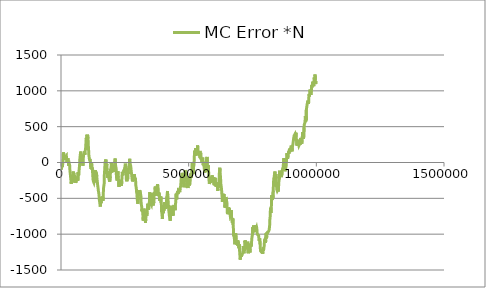
| Category | MC Error *N |
|---|---|
| 1000.0 | -82.468 |
| 2000.0 | -97.616 |
| 3000.0 | -39.064 |
| 4000.0 | -42.076 |
| 5000.0 | -59.528 |
| 6000.0 | -36.891 |
| 7000.0 | -31.486 |
| 8000.0 | 7.544 |
| 9000.0 | 118.393 |
| 10000.0 | 141.556 |
| 11000.0 | 136.393 |
| 12000.0 | 76.069 |
| 13000.0 | 33.678 |
| 14000.0 | 70.791 |
| 15000.0 | 76.55 |
| 16000.0 | 50.126 |
| 17000.0 | 74.916 |
| 18000.0 | 81.093 |
| 19000.0 | 65.289 |
| 20000.0 | 87.07 |
| 21000.0 | 93.611 |
| 22000.0 | 41.49 |
| 23000.0 | 3.009 |
| 24000.0 | 4.289 |
| 25000.0 | -4.933 |
| 26000.0 | 28.36 |
| 27000.0 | 57.634 |
| 28000.0 | 42.338 |
| 29000.0 | 18.747 |
| 30000.0 | -49.297 |
| 31000.0 | -48.808 |
| 32000.0 | -39.071 |
| 33000.0 | -25.79 |
| 34000.0 | -41.979 |
| 35000.0 | -119.978 |
| 36000.0 | -143.019 |
| 37000.0 | -179.984 |
| 38000.0 | -184.048 |
| 39000.0 | -256.712 |
| 40000.0 | -299.753 |
| 41000.0 | -304.82 |
| 42000.0 | -222.279 |
| 43000.0 | -204.757 |
| 44000.0 | -275.951 |
| 45000.0 | -289.793 |
| 46000.0 | -268.049 |
| 47000.0 | -195.778 |
| 48000.0 | -125.333 |
| 49000.0 | -176.207 |
| 50000.0 | -143.844 |
| 51000.0 | -208.307 |
| 52000.0 | -173.96 |
| 53000.0 | -178.803 |
| 54000.0 | -206.626 |
| 55000.0 | -208.008 |
| 56000.0 | -285.453 |
| 57000.0 | -260.282 |
| 58000.0 | -282.878 |
| 59000.0 | -254.226 |
| 60000.0 | -251.784 |
| 61000.0 | -220.48 |
| 62000.0 | -212.889 |
| 63000.0 | -197.778 |
| 64000.0 | -233.042 |
| 65000.0 | -239.03 |
| 66000.0 | -257.538 |
| 67000.0 | -137.582 |
| 68000.0 | -137.704 |
| 69000.0 | -179.078 |
| 70000.0 | -141.797 |
| 71000.0 | -102.411 |
| 72000.0 | -64.979 |
| 73000.0 | -24.107 |
| 74000.0 | 58.418 |
| 75000.0 | 71.056 |
| 76000.0 | 61.06 |
| 77000.0 | 152.34 |
| 78000.0 | 74.204 |
| 79000.0 | 58.545 |
| 80000.0 | 90.875 |
| 81000.0 | 79.782 |
| 82000.0 | 30.467 |
| 83000.0 | 76.831 |
| 84000.0 | 8.224 |
| 85000.0 | -25.244 |
| 86000.0 | -45.539 |
| 87000.0 | 6.055 |
| 88000.0 | 104.412 |
| 89000.0 | 109.615 |
| 90000.0 | 96.558 |
| 91000.0 | 115.941 |
| 92000.0 | 154.807 |
| 93000.0 | 105.469 |
| 94000.0 | 139.804 |
| 95000.0 | 168.879 |
| 96000.0 | 184.245 |
| 97000.0 | 231.136 |
| 98000.0 | 302.087 |
| 99000.0 | 344.087 |
| 100000.0 | 343.023 |
| 101000.0 | 288.453 |
| 102000.0 | 388.178 |
| 103000.0 | 335.303 |
| 104000.0 | 384.772 |
| 105000.0 | 378.957 |
| 106000.0 | 334.255 |
| 107000.0 | 237.358 |
| 108000.0 | 184.2 |
| 109000.0 | 108.766 |
| 110000.0 | 80.562 |
| 111000.0 | 54.744 |
| 112000.0 | 31.487 |
| 113000.0 | 49.776 |
| 114000.0 | 57.61 |
| 115000.0 | 7.081 |
| 116000.0 | -61.81 |
| 117000.0 | 0.093 |
| 118000.0 | -88.786 |
| 119000.0 | -72.045 |
| 120000.0 | -15.212 |
| 121000.0 | -95.313 |
| 122000.0 | -69.701 |
| 123000.0 | -109.204 |
| 124000.0 | -152.472 |
| 125000.0 | -209.936 |
| 126000.0 | -249.105 |
| 127000.0 | -263.08 |
| 128000.0 | -266.56 |
| 129000.0 | -280.642 |
| 130000.0 | -260.85 |
| 131000.0 | -260.081 |
| 132000.0 | -278.288 |
| 133000.0 | -197.477 |
| 134000.0 | -123.136 |
| 135000.0 | -105.848 |
| 136000.0 | -100.656 |
| 137000.0 | -156.032 |
| 138000.0 | -151.285 |
| 139000.0 | -141.359 |
| 140000.0 | -197.61 |
| 141000.0 | -195.279 |
| 142000.0 | -189.775 |
| 143000.0 | -292.816 |
| 144000.0 | -331.216 |
| 145000.0 | -347.388 |
| 146000.0 | -389.01 |
| 147000.0 | -404.955 |
| 148000.0 | -427.83 |
| 149000.0 | -454.234 |
| 150000.0 | -517.175 |
| 151000.0 | -540.276 |
| 152000.0 | -568.505 |
| 153000.0 | -595.627 |
| 154000.0 | -614.689 |
| 155000.0 | -579.111 |
| 156000.0 | -550.646 |
| 157000.0 | -565.343 |
| 158000.0 | -550.213 |
| 159000.0 | -499.182 |
| 160000.0 | -479.076 |
| 161000.0 | -495.682 |
| 162000.0 | -492.846 |
| 163000.0 | -478.05 |
| 164000.0 | -533.298 |
| 165000.0 | -473.969 |
| 166000.0 | -406.569 |
| 167000.0 | -345.85 |
| 168000.0 | -319.706 |
| 169000.0 | -297.132 |
| 170000.0 | -151.02 |
| 171000.0 | -109.493 |
| 172000.0 | -43.124 |
| 173000.0 | 6.31 |
| 174000.0 | 23.253 |
| 175000.0 | 36.187 |
| 176000.0 | 42.164 |
| 177000.0 | -55.437 |
| 178000.0 | -75.881 |
| 179000.0 | -19.096 |
| 180000.0 | -109.068 |
| 181000.0 | -124.003 |
| 182000.0 | -148.927 |
| 183000.0 | -216.709 |
| 184000.0 | -211.459 |
| 185000.0 | -124.23 |
| 186000.0 | -172.017 |
| 187000.0 | -208.246 |
| 188000.0 | -232.036 |
| 189000.0 | -239.09 |
| 190000.0 | -233.378 |
| 191000.0 | -267.912 |
| 192000.0 | -278.209 |
| 193000.0 | -194.878 |
| 194000.0 | -97.879 |
| 195000.0 | -91.527 |
| 196000.0 | -79.837 |
| 197000.0 | -4.851 |
| 198000.0 | -40.7 |
| 199000.0 | -140.648 |
| 200000.0 | -93.635 |
| 201000.0 | -84.845 |
| 202000.0 | -95.473 |
| 203000.0 | -75.674 |
| 204000.0 | -102.932 |
| 205000.0 | -85.724 |
| 206000.0 | -128.176 |
| 207000.0 | -91.846 |
| 208000.0 | -129.937 |
| 209000.0 | -128.235 |
| 210000.0 | -54.692 |
| 211000.0 | 23.753 |
| 212000.0 | 55.355 |
| 213000.0 | -22.11 |
| 214000.0 | -12.037 |
| 215000.0 | -21.065 |
| 216000.0 | -86.552 |
| 217000.0 | -185.743 |
| 218000.0 | -226.088 |
| 219000.0 | -234.077 |
| 220000.0 | -251.719 |
| 221000.0 | -201.404 |
| 222000.0 | -159.039 |
| 223000.0 | -122.755 |
| 224000.0 | -213.1 |
| 225000.0 | -243.853 |
| 226000.0 | -228.022 |
| 227000.0 | -338.815 |
| 228000.0 | -288.948 |
| 229000.0 | -259.031 |
| 230000.0 | -283.311 |
| 231000.0 | -299.486 |
| 232000.0 | -316.04 |
| 233000.0 | -295.843 |
| 234000.0 | -243.132 |
| 235000.0 | -310.953 |
| 236000.0 | -295.591 |
| 237000.0 | -326.101 |
| 238000.0 | -261.617 |
| 239000.0 | -259.66 |
| 240000.0 | -131.647 |
| 241000.0 | -152.607 |
| 242000.0 | -179.296 |
| 243000.0 | -179.777 |
| 244000.0 | -125.594 |
| 245000.0 | -130.01 |
| 246000.0 | -143.916 |
| 247000.0 | -100.169 |
| 248000.0 | -120.296 |
| 249000.0 | -107.477 |
| 250000.0 | -72.78 |
| 251000.0 | -66.152 |
| 252000.0 | -16.166 |
| 253000.0 | -46.079 |
| 254000.0 | -105.121 |
| 255000.0 | -109.538 |
| 256000.0 | -239.754 |
| 257000.0 | -223.909 |
| 258000.0 | -261.714 |
| 259000.0 | -146.728 |
| 260000.0 | -182.181 |
| 261000.0 | -231.902 |
| 262000.0 | -137.757 |
| 263000.0 | -160.946 |
| 264000.0 | -94.052 |
| 265000.0 | -98.138 |
| 266000.0 | -46.912 |
| 267000.0 | -26.196 |
| 268000.0 | 14.417 |
| 269000.0 | 51.525 |
| 270000.0 | -2.438 |
| 271000.0 | -2.842 |
| 272000.0 | -14.028 |
| 273000.0 | -49.486 |
| 274000.0 | -57.141 |
| 275000.0 | -117.328 |
| 276000.0 | -130.025 |
| 277000.0 | -178.099 |
| 278000.0 | -220.145 |
| 279000.0 | -239.554 |
| 280000.0 | -264.379 |
| 281000.0 | -267.36 |
| 282000.0 | -234.152 |
| 283000.0 | -250.183 |
| 284000.0 | -229.082 |
| 285000.0 | -219.236 |
| 286000.0 | -200.168 |
| 287000.0 | -219.902 |
| 288000.0 | -164.874 |
| 289000.0 | -255.771 |
| 290000.0 | -219.467 |
| 291000.0 | -231.454 |
| 292000.0 | -242.619 |
| 293000.0 | -317.876 |
| 294000.0 | -338.551 |
| 295000.0 | -359.833 |
| 296000.0 | -412.486 |
| 297000.0 | -428.45 |
| 298000.0 | -477.751 |
| 299000.0 | -522.772 |
| 300000.0 | -555.997 |
| 301000.0 | -576.162 |
| 302000.0 | -580.133 |
| 303000.0 | -473.569 |
| 304000.0 | -410.981 |
| 305000.0 | -443.267 |
| 306000.0 | -409.481 |
| 307000.0 | -458.447 |
| 308000.0 | -386.068 |
| 309000.0 | -384.334 |
| 310000.0 | -376.459 |
| 311000.0 | -423.918 |
| 312000.0 | -415.28 |
| 313000.0 | -469.769 |
| 314000.0 | -573.981 |
| 315000.0 | -568.119 |
| 316000.0 | -615.925 |
| 317000.0 | -682.175 |
| 318000.0 | -651.02 |
| 319000.0 | -681.049 |
| 320000.0 | -698.451 |
| 321000.0 | -750.356 |
| 322000.0 | -811.21 |
| 323000.0 | -738.601 |
| 324000.0 | -701.836 |
| 325000.0 | -643.708 |
| 326000.0 | -683.591 |
| 327000.0 | -757.274 |
| 328000.0 | -784.324 |
| 329000.0 | -735.603 |
| 330000.0 | -803.864 |
| 331000.0 | -843.97 |
| 332000.0 | -782.929 |
| 333000.0 | -750.456 |
| 334000.0 | -748.862 |
| 335000.0 | -690.104 |
| 336000.0 | -744.298 |
| 337000.0 | -667.56 |
| 338000.0 | -668.975 |
| 339000.0 | -630.053 |
| 340000.0 | -575.97 |
| 341000.0 | -635.038 |
| 342000.0 | -606.851 |
| 343000.0 | -658.585 |
| 344000.0 | -645.922 |
| 345000.0 | -576.543 |
| 346000.0 | -561.966 |
| 347000.0 | -468.333 |
| 348000.0 | -414.934 |
| 349000.0 | -506.667 |
| 350000.0 | -607.742 |
| 351000.0 | -564.601 |
| 352000.0 | -566.082 |
| 353000.0 | -578.105 |
| 354000.0 | -587.996 |
| 355000.0 | -575.242 |
| 356000.0 | -525.799 |
| 357000.0 | -458.566 |
| 358000.0 | -429.038 |
| 359000.0 | -498.606 |
| 360000.0 | -510.433 |
| 361000.0 | -600.676 |
| 362000.0 | -529.443 |
| 363000.0 | -566.215 |
| 364000.0 | -492.965 |
| 365000.0 | -413.579 |
| 366000.0 | -463.316 |
| 367000.0 | -423.372 |
| 368000.0 | -396.209 |
| 369000.0 | -335.795 |
| 370000.0 | -402.039 |
| 371000.0 | -415.175 |
| 372000.0 | -426.31 |
| 373000.0 | -464.202 |
| 374000.0 | -415.69 |
| 375000.0 | -454.354 |
| 376000.0 | -390.29 |
| 377000.0 | -327.507 |
| 378000.0 | -302.916 |
| 379000.0 | -326.854 |
| 380000.0 | -327.726 |
| 381000.0 | -374.314 |
| 382000.0 | -470.724 |
| 383000.0 | -443.543 |
| 384000.0 | -420.227 |
| 385000.0 | -431.615 |
| 386000.0 | -433.568 |
| 387000.0 | -532.693 |
| 388000.0 | -504.718 |
| 389000.0 | -501.119 |
| 390000.0 | -522.238 |
| 391000.0 | -474.124 |
| 392000.0 | -559.565 |
| 393000.0 | -576.704 |
| 394000.0 | -688.438 |
| 395000.0 | -706.842 |
| 396000.0 | -708.778 |
| 397000.0 | -786.45 |
| 398000.0 | -701.499 |
| 399000.0 | -669.228 |
| 400000.0 | -683.198 |
| 401000.0 | -708.038 |
| 402000.0 | -634.969 |
| 403000.0 | -672.931 |
| 404000.0 | -616.979 |
| 405000.0 | -554.094 |
| 406000.0 | -543.347 |
| 407000.0 | -614.593 |
| 408000.0 | -558.207 |
| 409000.0 | -586.4 |
| 410000.0 | -647.797 |
| 411000.0 | -626.713 |
| 412000.0 | -600.604 |
| 413000.0 | -585.406 |
| 414000.0 | -490.124 |
| 415000.0 | -513.231 |
| 416000.0 | -445.837 |
| 417000.0 | -397.071 |
| 418000.0 | -462.348 |
| 419000.0 | -476.86 |
| 420000.0 | -578.937 |
| 421000.0 | -606.313 |
| 422000.0 | -667.661 |
| 423000.0 | -687.781 |
| 424000.0 | -729.748 |
| 425000.0 | -754.994 |
| 426000.0 | -777.387 |
| 427000.0 | -787.068 |
| 428000.0 | -813.737 |
| 429000.0 | -725.294 |
| 430000.0 | -683.769 |
| 431000.0 | -604.297 |
| 432000.0 | -666.691 |
| 433000.0 | -645.779 |
| 434000.0 | -649.902 |
| 435000.0 | -703.01 |
| 436000.0 | -626.384 |
| 437000.0 | -711.568 |
| 438000.0 | -713.284 |
| 439000.0 | -744.057 |
| 440000.0 | -660.679 |
| 441000.0 | -608.902 |
| 442000.0 | -593.666 |
| 443000.0 | -596.15 |
| 444000.0 | -604.758 |
| 445000.0 | -632.723 |
| 446000.0 | -630.807 |
| 447000.0 | -665.502 |
| 448000.0 | -585.443 |
| 449000.0 | -563.787 |
| 450000.0 | -513.638 |
| 451000.0 | -433.513 |
| 452000.0 | -497.041 |
| 453000.0 | -513.019 |
| 454000.0 | -488.851 |
| 455000.0 | -449.623 |
| 456000.0 | -405.373 |
| 457000.0 | -440.159 |
| 458000.0 | -394.677 |
| 459000.0 | -432.672 |
| 460000.0 | -382.821 |
| 461000.0 | -388.898 |
| 462000.0 | -373.911 |
| 463000.0 | -372.075 |
| 464000.0 | -390.674 |
| 465000.0 | -413.966 |
| 466000.0 | -362.829 |
| 467000.0 | -352.206 |
| 468000.0 | -342.188 |
| 469000.0 | -320.025 |
| 470000.0 | -263.567 |
| 471000.0 | -213.478 |
| 472000.0 | -200.235 |
| 473000.0 | -211.742 |
| 474000.0 | -221.479 |
| 475000.0 | -144.594 |
| 476000.0 | -194.788 |
| 477000.0 | -274.572 |
| 478000.0 | -251.25 |
| 479000.0 | -261.088 |
| 480000.0 | -286.519 |
| 481000.0 | -345.812 |
| 482000.0 | -356.423 |
| 483000.0 | -281.433 |
| 484000.0 | -213.239 |
| 485000.0 | -162.518 |
| 486000.0 | -110.261 |
| 487000.0 | -115.923 |
| 488000.0 | -118.01 |
| 489000.0 | -134.742 |
| 490000.0 | -163.67 |
| 491000.0 | -201.589 |
| 492000.0 | -265.532 |
| 493000.0 | -349.547 |
| 494000.0 | -322.341 |
| 495000.0 | -341.229 |
| 496000.0 | -308.028 |
| 497000.0 | -356.937 |
| 498000.0 | -259.465 |
| 499000.0 | -309.106 |
| 500000.0 | -214.912 |
| 501000.0 | -231.312 |
| 502000.0 | -210.485 |
| 503000.0 | -318.147 |
| 504000.0 | -315.449 |
| 505000.0 | -294.609 |
| 506000.0 | -254.887 |
| 507000.0 | -202.2 |
| 508000.0 | -152.713 |
| 509000.0 | -197.884 |
| 510000.0 | -165.315 |
| 511000.0 | -212.107 |
| 512000.0 | -146.852 |
| 513000.0 | -56.112 |
| 514000.0 | 4.202 |
| 515000.0 | -25.014 |
| 516000.0 | -12.387 |
| 517000.0 | -107.859 |
| 518000.0 | -155.589 |
| 519000.0 | -62.416 |
| 520000.0 | -67.703 |
| 521000.0 | -30.544 |
| 522000.0 | 84.636 |
| 523000.0 | 114.446 |
| 524000.0 | 165.087 |
| 525000.0 | 93.749 |
| 526000.0 | 104.565 |
| 527000.0 | 197.634 |
| 528000.0 | 99.843 |
| 529000.0 | 182.85 |
| 530000.0 | 146.034 |
| 531000.0 | 109.401 |
| 532000.0 | 185.842 |
| 533000.0 | 170.432 |
| 534000.0 | 197.296 |
| 535000.0 | 238.694 |
| 536000.0 | 182.405 |
| 537000.0 | 153.267 |
| 538000.0 | 138.425 |
| 539000.0 | 137.593 |
| 540000.0 | 135.578 |
| 541000.0 | 91.834 |
| 542000.0 | 95.421 |
| 543000.0 | 101.876 |
| 544000.0 | 161.893 |
| 545000.0 | 59.915 |
| 546000.0 | 105.807 |
| 547000.0 | 135.404 |
| 548000.0 | 68.6 |
| 549000.0 | 39.712 |
| 550000.0 | 62.264 |
| 551000.0 | 28.503 |
| 552000.0 | -7.051 |
| 553000.0 | -1.509 |
| 554000.0 | 40.016 |
| 555000.0 | 68.288 |
| 556000.0 | -6.222 |
| 557000.0 | -38.306 |
| 558000.0 | -3.903 |
| 559000.0 | -32.697 |
| 560000.0 | -38.254 |
| 561000.0 | -72.989 |
| 562000.0 | -118.233 |
| 563000.0 | -140.593 |
| 564000.0 | -110.278 |
| 565000.0 | -104.186 |
| 566000.0 | -56.692 |
| 567000.0 | -18.922 |
| 568000.0 | -8.969 |
| 569000.0 | 16.776 |
| 570000.0 | 47.626 |
| 571000.0 | 20.06 |
| 572000.0 | 78.213 |
| 573000.0 | -67.194 |
| 574000.0 | -133.593 |
| 575000.0 | -133.036 |
| 576000.0 | -35.356 |
| 577000.0 | -41.126 |
| 578000.0 | -111.923 |
| 579000.0 | -211.193 |
| 580000.0 | -220.568 |
| 581000.0 | -298.687 |
| 582000.0 | -295.685 |
| 583000.0 | -275.183 |
| 584000.0 | -246.599 |
| 585000.0 | -256.987 |
| 586000.0 | -283.765 |
| 587000.0 | -293.316 |
| 588000.0 | -239.113 |
| 589000.0 | -199.665 |
| 590000.0 | -252.133 |
| 591000.0 | -197.791 |
| 592000.0 | -179.006 |
| 593000.0 | -224.037 |
| 594000.0 | -274.907 |
| 595000.0 | -212.23 |
| 596000.0 | -210.316 |
| 597000.0 | -243.618 |
| 598000.0 | -207.425 |
| 599000.0 | -210.731 |
| 600000.0 | -317.31 |
| 601000.0 | -276.668 |
| 602000.0 | -283.256 |
| 603000.0 | -250.352 |
| 604000.0 | -213.826 |
| 605000.0 | -298.668 |
| 606000.0 | -321.82 |
| 607000.0 | -302.385 |
| 608000.0 | -338.816 |
| 609000.0 | -280.41 |
| 610000.0 | -283.538 |
| 611000.0 | -309.062 |
| 612000.0 | -306.481 |
| 613000.0 | -342.973 |
| 614000.0 | -397.338 |
| 615000.0 | -364.45 |
| 616000.0 | -321.799 |
| 617000.0 | -346.793 |
| 618000.0 | -286.308 |
| 619000.0 | -245.72 |
| 620000.0 | -155.832 |
| 621000.0 | -157.534 |
| 622000.0 | -72.964 |
| 623000.0 | -130.613 |
| 624000.0 | -170 |
| 625000.0 | -223.003 |
| 626000.0 | -296.218 |
| 627000.0 | -289.117 |
| 628000.0 | -349.954 |
| 629000.0 | -387.112 |
| 630000.0 | -439.649 |
| 631000.0 | -470.846 |
| 632000.0 | -551.035 |
| 633000.0 | -523.943 |
| 634000.0 | -449.543 |
| 635000.0 | -491.996 |
| 636000.0 | -437.282 |
| 637000.0 | -479.595 |
| 638000.0 | -440.406 |
| 639000.0 | -486.403 |
| 640000.0 | -497.58 |
| 641000.0 | -560.237 |
| 642000.0 | -630.485 |
| 643000.0 | -585.5 |
| 644000.0 | -549.02 |
| 645000.0 | -542.11 |
| 646000.0 | -481.965 |
| 647000.0 | -475.402 |
| 648000.0 | -468.533 |
| 649000.0 | -548.832 |
| 650000.0 | -564.826 |
| 651000.0 | -681.38 |
| 652000.0 | -721.316 |
| 653000.0 | -707.762 |
| 654000.0 | -725.327 |
| 655000.0 | -718.172 |
| 656000.0 | -647.94 |
| 657000.0 | -626.784 |
| 658000.0 | -654.177 |
| 659000.0 | -689.819 |
| 660000.0 | -644.027 |
| 661000.0 | -687.417 |
| 662000.0 | -716.539 |
| 663000.0 | -745.708 |
| 664000.0 | -751.07 |
| 665000.0 | -729.909 |
| 666000.0 | -736.227 |
| 667000.0 | -664.219 |
| 668000.0 | -752.468 |
| 669000.0 | -801.476 |
| 670000.0 | -791.813 |
| 671000.0 | -840.169 |
| 672000.0 | -815.295 |
| 673000.0 | -777.624 |
| 674000.0 | -866.468 |
| 675000.0 | -903.079 |
| 676000.0 | -1021.8 |
| 677000.0 | -1003.613 |
| 678000.0 | -1033.024 |
| 679000.0 | -1022.966 |
| 680000.0 | -1089.577 |
| 681000.0 | -1141.628 |
| 682000.0 | -1076.076 |
| 683000.0 | -1025.303 |
| 684000.0 | -987.545 |
| 685000.0 | -994.748 |
| 686000.0 | -1060.149 |
| 687000.0 | -1064.207 |
| 688000.0 | -1129.578 |
| 689000.0 | -1149.288 |
| 690000.0 | -1139.468 |
| 691000.0 | -1115.267 |
| 692000.0 | -1081.881 |
| 693000.0 | -1163.213 |
| 694000.0 | -1104.482 |
| 695000.0 | -1141.686 |
| 696000.0 | -1163.005 |
| 697000.0 | -1197.594 |
| 698000.0 | -1142.968 |
| 699000.0 | -1212.49 |
| 700000.0 | -1258.751 |
| 701000.0 | -1322.21 |
| 702000.0 | -1355.918 |
| 703000.0 | -1320.1 |
| 704000.0 | -1264.07 |
| 705000.0 | -1283.469 |
| 706000.0 | -1294.951 |
| 707000.0 | -1313.958 |
| 708000.0 | -1291.044 |
| 709000.0 | -1287.779 |
| 710000.0 | -1281.22 |
| 711000.0 | -1291.317 |
| 712000.0 | -1265.056 |
| 713000.0 | -1197.776 |
| 714000.0 | -1165.524 |
| 715000.0 | -1212.84 |
| 716000.0 | -1264.155 |
| 717000.0 | -1257.185 |
| 718000.0 | -1247.106 |
| 719000.0 | -1187.909 |
| 720000.0 | -1092.754 |
| 721000.0 | -1110.737 |
| 722000.0 | -1088.877 |
| 723000.0 | -1116.631 |
| 724000.0 | -1105.777 |
| 725000.0 | -1124.517 |
| 726000.0 | -1157.284 |
| 727000.0 | -1202.404 |
| 728000.0 | -1159.934 |
| 729000.0 | -1140.179 |
| 730000.0 | -1210.592 |
| 731000.0 | -1104.58 |
| 732000.0 | -1208.904 |
| 733000.0 | -1267.436 |
| 734000.0 | -1204.176 |
| 735000.0 | -1215.295 |
| 736000.0 | -1182.761 |
| 737000.0 | -1194.084 |
| 738000.0 | -1183.119 |
| 739000.0 | -1169.643 |
| 740000.0 | -1254.583 |
| 741000.0 | -1210.503 |
| 742000.0 | -1170.295 |
| 743000.0 | -1126.76 |
| 744000.0 | -1115.631 |
| 745000.0 | -1171.45 |
| 746000.0 | -1131.077 |
| 747000.0 | -1075.289 |
| 748000.0 | -1039.302 |
| 749000.0 | -1039.278 |
| 750000.0 | -1004.812 |
| 751000.0 | -902.289 |
| 752000.0 | -956.606 |
| 753000.0 | -915.328 |
| 754000.0 | -878.737 |
| 755000.0 | -928.091 |
| 756000.0 | -951.446 |
| 757000.0 | -953.681 |
| 758000.0 | -940.685 |
| 759000.0 | -931.272 |
| 760000.0 | -921.277 |
| 761000.0 | -874.427 |
| 762000.0 | -969.858 |
| 763000.0 | -968.6 |
| 764000.0 | -923.5 |
| 765000.0 | -918.987 |
| 766000.0 | -903.726 |
| 767000.0 | -921.011 |
| 768000.0 | -981.715 |
| 769000.0 | -992.086 |
| 770000.0 | -1005.207 |
| 771000.0 | -993.484 |
| 772000.0 | -1014.994 |
| 773000.0 | -993.586 |
| 774000.0 | -1018.324 |
| 775000.0 | -1008.634 |
| 776000.0 | -1092.848 |
| 777000.0 | -1082.103 |
| 778000.0 | -1058.631 |
| 779000.0 | -1072.448 |
| 780000.0 | -1145.86 |
| 781000.0 | -1215.965 |
| 782000.0 | -1224.515 |
| 783000.0 | -1247.582 |
| 784000.0 | -1252.677 |
| 785000.0 | -1223.525 |
| 786000.0 | -1250.559 |
| 787000.0 | -1265.501 |
| 788000.0 | -1246.253 |
| 789000.0 | -1254.505 |
| 790000.0 | -1272.588 |
| 791000.0 | -1250.652 |
| 792000.0 | -1184.545 |
| 793000.0 | -1234.346 |
| 794000.0 | -1197.596 |
| 795000.0 | -1179.572 |
| 796000.0 | -1162.108 |
| 797000.0 | -1083.111 |
| 798000.0 | -1072.717 |
| 799000.0 | -1071.127 |
| 800000.0 | -1062.972 |
| 801000.0 | -1123.095 |
| 802000.0 | -1081.84 |
| 803000.0 | -988.575 |
| 804000.0 | -1036.674 |
| 805000.0 | -1058.958 |
| 806000.0 | -1021.947 |
| 807000.0 | -972.088 |
| 808000.0 | -993.152 |
| 809000.0 | -971.701 |
| 810000.0 | -970.643 |
| 811000.0 | -984.688 |
| 812000.0 | -969.025 |
| 813000.0 | -961.586 |
| 814000.0 | -953.01 |
| 815000.0 | -944.029 |
| 816000.0 | -938.514 |
| 817000.0 | -886.921 |
| 818000.0 | -795.455 |
| 819000.0 | -765.167 |
| 820000.0 | -673.411 |
| 821000.0 | -630.683 |
| 822000.0 | -701.076 |
| 823000.0 | -681.141 |
| 824000.0 | -602.751 |
| 825000.0 | -454.999 |
| 826000.0 | -498.736 |
| 827000.0 | -521.798 |
| 828000.0 | -501.706 |
| 829000.0 | -461.637 |
| 830000.0 | -492.748 |
| 831000.0 | -394.281 |
| 832000.0 | -322.602 |
| 833000.0 | -230.772 |
| 834000.0 | -237.831 |
| 835000.0 | -200.079 |
| 836000.0 | -170.29 |
| 837000.0 | -171.439 |
| 838000.0 | -126.521 |
| 839000.0 | -217.862 |
| 840000.0 | -184.054 |
| 841000.0 | -182.564 |
| 842000.0 | -161.804 |
| 843000.0 | -225.454 |
| 844000.0 | -313.14 |
| 845000.0 | -373.642 |
| 846000.0 | -378.392 |
| 847000.0 | -395.243 |
| 848000.0 | -398.82 |
| 849000.0 | -380.412 |
| 850000.0 | -391.994 |
| 851000.0 | -405.575 |
| 852000.0 | -353.513 |
| 853000.0 | -275.625 |
| 854000.0 | -267.295 |
| 855000.0 | -221.23 |
| 856000.0 | -113.751 |
| 857000.0 | -137.81 |
| 858000.0 | -146.39 |
| 859000.0 | -180.583 |
| 860000.0 | -180.33 |
| 861000.0 | -163.686 |
| 862000.0 | -203.147 |
| 863000.0 | -202.842 |
| 864000.0 | -201.971 |
| 865000.0 | -199.658 |
| 866000.0 | -152.849 |
| 867000.0 | -117.468 |
| 868000.0 | -84.727 |
| 869000.0 | -95.155 |
| 870000.0 | -68.329 |
| 871000.0 | -21.972 |
| 872000.0 | -7.85 |
| 873000.0 | 61.965 |
| 874000.0 | -32.554 |
| 875000.0 | -75.48 |
| 876000.0 | -99.383 |
| 877000.0 | -122.14 |
| 878000.0 | -100.886 |
| 879000.0 | -99.285 |
| 880000.0 | -78.497 |
| 881000.0 | -65.845 |
| 882000.0 | -46.989 |
| 883000.0 | 34.369 |
| 884000.0 | 79.157 |
| 885000.0 | 131.685 |
| 886000.0 | 95.913 |
| 887000.0 | 56.316 |
| 888000.0 | 58.9 |
| 889000.0 | 72.073 |
| 890000.0 | 88.222 |
| 891000.0 | 155.552 |
| 892000.0 | 158.82 |
| 893000.0 | 124.095 |
| 894000.0 | 172.062 |
| 895000.0 | 193.033 |
| 896000.0 | 147.369 |
| 897000.0 | 166.615 |
| 898000.0 | 182.13 |
| 899000.0 | 171.156 |
| 900000.0 | 181.003 |
| 901000.0 | 195.569 |
| 902000.0 | 235.749 |
| 903000.0 | 225.08 |
| 904000.0 | 176.244 |
| 905000.0 | 155.464 |
| 906000.0 | 215.505 |
| 907000.0 | 217.745 |
| 908000.0 | 249.093 |
| 909000.0 | 258.218 |
| 910000.0 | 261.165 |
| 911000.0 | 330.371 |
| 912000.0 | 321.328 |
| 913000.0 | 374.033 |
| 914000.0 | 381.704 |
| 915000.0 | 369.279 |
| 916000.0 | 384.397 |
| 917000.0 | 399.523 |
| 918000.0 | 403.052 |
| 919000.0 | 371.807 |
| 920000.0 | 414.924 |
| 921000.0 | 359.4 |
| 922000.0 | 346.728 |
| 923000.0 | 290.893 |
| 924000.0 | 234.818 |
| 925000.0 | 316.882 |
| 926000.0 | 294.226 |
| 927000.0 | 265.732 |
| 928000.0 | 282.096 |
| 929000.0 | 261.241 |
| 930000.0 | 293.33 |
| 931000.0 | 257.208 |
| 932000.0 | 236.755 |
| 933000.0 | 223.685 |
| 934000.0 | 251.73 |
| 935000.0 | 267.623 |
| 936000.0 | 247.402 |
| 937000.0 | 267.036 |
| 938000.0 | 308.125 |
| 939000.0 | 344.01 |
| 940000.0 | 304.499 |
| 941000.0 | 318.581 |
| 942000.0 | 323.493 |
| 943000.0 | 263.636 |
| 944000.0 | 320.385 |
| 945000.0 | 340.289 |
| 946000.0 | 422.007 |
| 947000.0 | 364.754 |
| 948000.0 | 404.092 |
| 949000.0 | 368.207 |
| 950000.0 | 330.435 |
| 951000.0 | 338.537 |
| 952000.0 | 490.389 |
| 953000.0 | 532.587 |
| 954000.0 | 545.067 |
| 955000.0 | 553.189 |
| 956000.0 | 586.311 |
| 957000.0 | 641.658 |
| 958000.0 | 563.769 |
| 959000.0 | 641.46 |
| 960000.0 | 587.992 |
| 961000.0 | 735.007 |
| 962000.0 | 762.33 |
| 963000.0 | 768.9 |
| 964000.0 | 811.792 |
| 965000.0 | 822.324 |
| 966000.0 | 799.459 |
| 967000.0 | 863.554 |
| 968000.0 | 837.35 |
| 969000.0 | 819.913 |
| 970000.0 | 841.058 |
| 971000.0 | 935.235 |
| 972000.0 | 957.084 |
| 973000.0 | 922.463 |
| 974000.0 | 952.973 |
| 975000.0 | 1018.564 |
| 976000.0 | 1004.026 |
| 977000.0 | 975.49 |
| 978000.0 | 973.242 |
| 979000.0 | 943.029 |
| 980000.0 | 997.046 |
| 981000.0 | 1015.224 |
| 982000.0 | 1080.708 |
| 983000.0 | 1048.352 |
| 984000.0 | 1080.935 |
| 985000.0 | 1076.454 |
| 986000.0 | 1128.827 |
| 987000.0 | 1111.443 |
| 988000.0 | 1068.297 |
| 989000.0 | 1083.218 |
| 990000.0 | 1066.173 |
| 991000.0 | 1123.806 |
| 992000.0 | 1185.994 |
| 993000.0 | 1110.482 |
| 994000.0 | 1144.11 |
| 995000.0 | 1228.582 |
| 996000.0 | 1148.405 |
| 997000.0 | 1098.524 |
| 998000.0 | 1099.962 |
| 999000.0 | 1116.288 |
| 1000000.0 | 1135.414 |